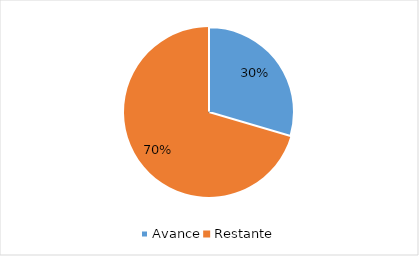
| Category | Series 0 |
|---|---|
| Avance | 0.295 |
| Restante | 0.705 |